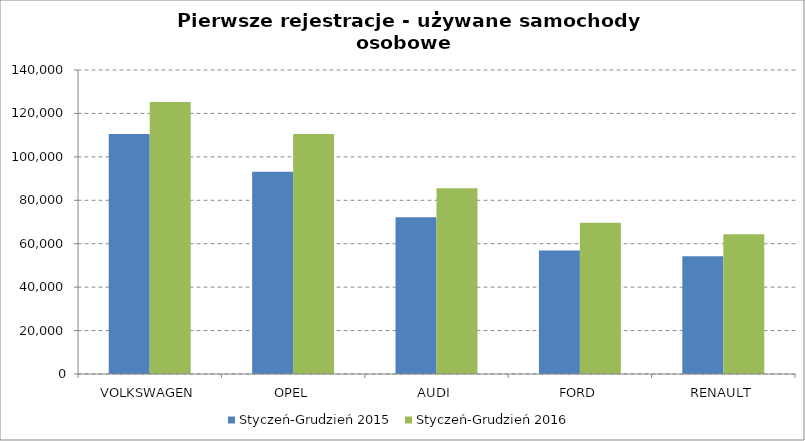
| Category | Styczeń-Grudzień 2015 | Styczeń-Grudzień 2016 |
|---|---|---|
| VOLKSWAGEN | 110493 | 125239 |
| OPEL | 93109 | 110564 |
| AUDI | 72143 | 85552 |
| FORD | 56870 | 69693 |
| RENAULT | 54221 | 64328 |